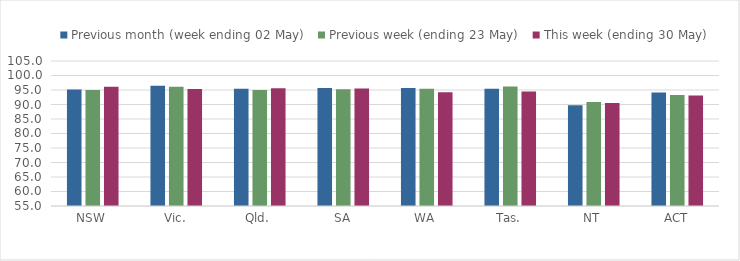
| Category | Previous month (week ending 02 May) | Previous week (ending 23 May) | This week (ending 30 May) |
|---|---|---|---|
| NSW | 95.183 | 95.001 | 96.151 |
| Vic. | 96.501 | 96.096 | 95.309 |
| Qld. | 95.462 | 95.035 | 95.587 |
| SA | 95.728 | 95.225 | 95.533 |
| WA | 95.655 | 95.404 | 94.224 |
| Tas. | 95.473 | 96.204 | 94.505 |
| NT | 89.78 | 90.881 | 90.517 |
| ACT | 94.12 | 93.274 | 93.076 |